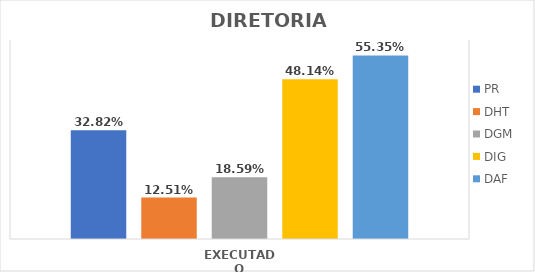
| Category | PR | DHT | DGM | DIG | DAF |
|---|---|---|---|---|---|
| EXECUTADO | 0.328 | 0.125 | 0.186 | 0.481 | 0.554 |